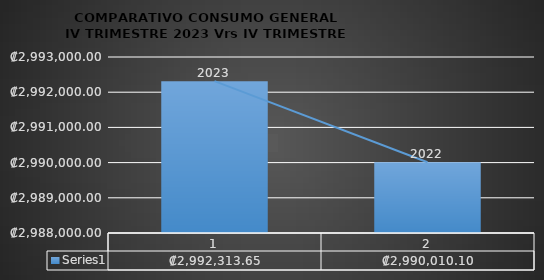
| Category | Series 0 |
|---|---|
| 0 | 2992313.65 |
| 1 | 2990010.1 |